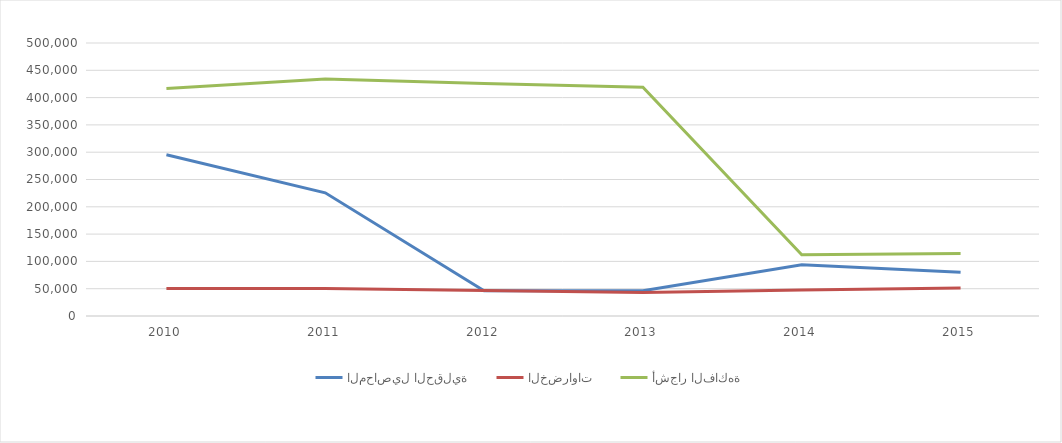
| Category | المحاصيل الحقلية | الخضراوات | أشجار الفاكهة |
|---|---|---|---|
| 2010.0 | 295461 | 50254 | 416721 |
| 2011.0 | 225624 | 50181 | 433980 |
| 2012.0 | 46081.087 | 46858 | 425822 |
| 2013.0 | 46289.409 | 43210 | 418989 |
| 2014.0 | 94054.088 | 47651.447 | 112308.24 |
| 2015.0 | 80216.602 | 51352.025 | 114297.908 |